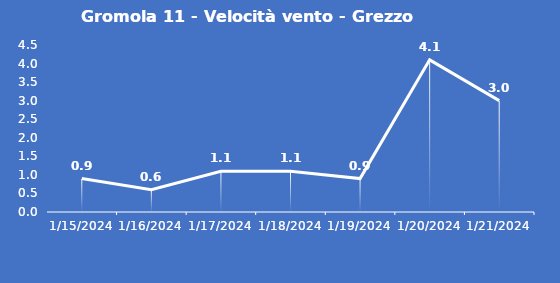
| Category | Gromola 11 - Velocità vento - Grezzo (m/s) |
|---|---|
| 1/15/24 | 0.9 |
| 1/16/24 | 0.6 |
| 1/17/24 | 1.1 |
| 1/18/24 | 1.1 |
| 1/19/24 | 0.9 |
| 1/20/24 | 4.1 |
| 1/21/24 | 3 |